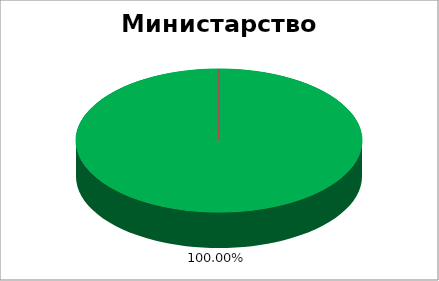
| Category | Министарство привреде  |
|---|---|
| 0 | 1 |
| 1 | 0 |
| 2 | 0 |
| 3 | 0 |
| 4 | 0 |